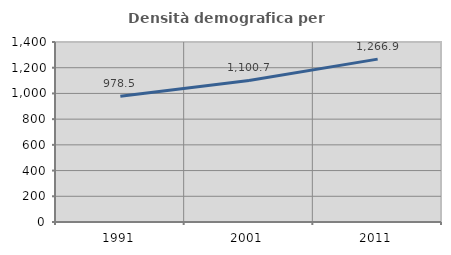
| Category | Densità demografica |
|---|---|
| 1991.0 | 978.475 |
| 2001.0 | 1100.715 |
| 2011.0 | 1266.888 |